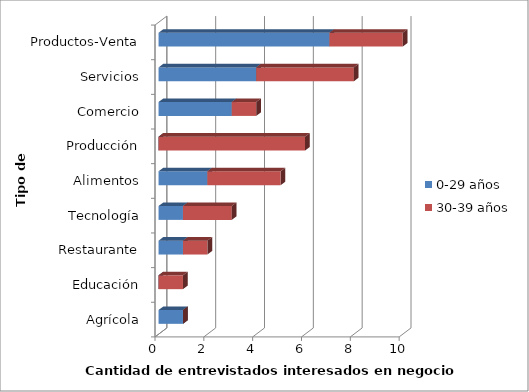
| Category | 0-29 años | 30-39 años |
|---|---|---|
| Agrícola | 1 | 0 |
| Educación | 0 | 1 |
| Restaurante | 1 | 1 |
| Tecnología | 1 | 2 |
| Alimentos | 2 | 3 |
| Producción | 0 | 6 |
| Comercio | 3 | 1 |
| Servicios | 4 | 4 |
| Productos-Venta | 7 | 3 |